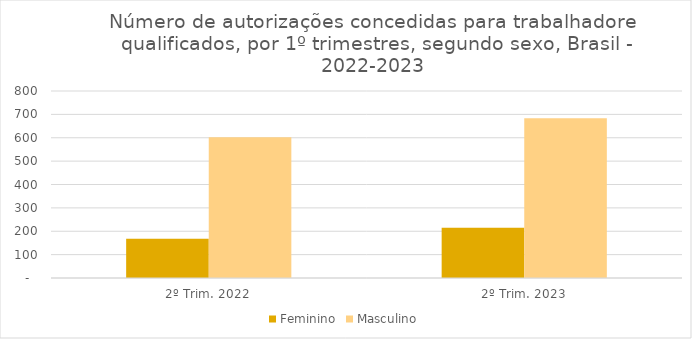
| Category | Feminino | Masculino |
|---|---|---|
| 2º Trim. 2022 | 168 | 602 |
| 2º Trim. 2023 | 215 | 683 |